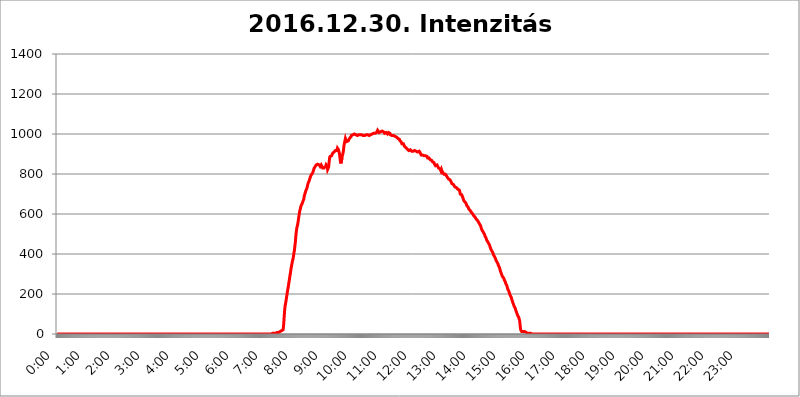
| Category | 2016.12.30. Intenzitás [W/m^2] |
|---|---|
| 0.0 | 0 |
| 0.0006944444444444445 | 0 |
| 0.001388888888888889 | 0 |
| 0.0020833333333333333 | 0 |
| 0.002777777777777778 | 0 |
| 0.003472222222222222 | 0 |
| 0.004166666666666667 | 0 |
| 0.004861111111111111 | 0 |
| 0.005555555555555556 | 0 |
| 0.0062499999999999995 | 0 |
| 0.006944444444444444 | 0 |
| 0.007638888888888889 | 0 |
| 0.008333333333333333 | 0 |
| 0.009027777777777779 | 0 |
| 0.009722222222222222 | 0 |
| 0.010416666666666666 | 0 |
| 0.011111111111111112 | 0 |
| 0.011805555555555555 | 0 |
| 0.012499999999999999 | 0 |
| 0.013194444444444444 | 0 |
| 0.013888888888888888 | 0 |
| 0.014583333333333332 | 0 |
| 0.015277777777777777 | 0 |
| 0.015972222222222224 | 0 |
| 0.016666666666666666 | 0 |
| 0.017361111111111112 | 0 |
| 0.018055555555555557 | 0 |
| 0.01875 | 0 |
| 0.019444444444444445 | 0 |
| 0.02013888888888889 | 0 |
| 0.020833333333333332 | 0 |
| 0.02152777777777778 | 0 |
| 0.022222222222222223 | 0 |
| 0.02291666666666667 | 0 |
| 0.02361111111111111 | 0 |
| 0.024305555555555556 | 0 |
| 0.024999999999999998 | 0 |
| 0.025694444444444447 | 0 |
| 0.02638888888888889 | 0 |
| 0.027083333333333334 | 0 |
| 0.027777777777777776 | 0 |
| 0.02847222222222222 | 0 |
| 0.029166666666666664 | 0 |
| 0.029861111111111113 | 0 |
| 0.030555555555555555 | 0 |
| 0.03125 | 0 |
| 0.03194444444444445 | 0 |
| 0.03263888888888889 | 0 |
| 0.03333333333333333 | 0 |
| 0.034027777777777775 | 0 |
| 0.034722222222222224 | 0 |
| 0.035416666666666666 | 0 |
| 0.036111111111111115 | 0 |
| 0.03680555555555556 | 0 |
| 0.0375 | 0 |
| 0.03819444444444444 | 0 |
| 0.03888888888888889 | 0 |
| 0.03958333333333333 | 0 |
| 0.04027777777777778 | 0 |
| 0.04097222222222222 | 0 |
| 0.041666666666666664 | 0 |
| 0.042361111111111106 | 0 |
| 0.04305555555555556 | 0 |
| 0.043750000000000004 | 0 |
| 0.044444444444444446 | 0 |
| 0.04513888888888889 | 0 |
| 0.04583333333333334 | 0 |
| 0.04652777777777778 | 0 |
| 0.04722222222222222 | 0 |
| 0.04791666666666666 | 0 |
| 0.04861111111111111 | 0 |
| 0.049305555555555554 | 0 |
| 0.049999999999999996 | 0 |
| 0.05069444444444445 | 0 |
| 0.051388888888888894 | 0 |
| 0.052083333333333336 | 0 |
| 0.05277777777777778 | 0 |
| 0.05347222222222222 | 0 |
| 0.05416666666666667 | 0 |
| 0.05486111111111111 | 0 |
| 0.05555555555555555 | 0 |
| 0.05625 | 0 |
| 0.05694444444444444 | 0 |
| 0.057638888888888885 | 0 |
| 0.05833333333333333 | 0 |
| 0.05902777777777778 | 0 |
| 0.059722222222222225 | 0 |
| 0.06041666666666667 | 0 |
| 0.061111111111111116 | 0 |
| 0.06180555555555556 | 0 |
| 0.0625 | 0 |
| 0.06319444444444444 | 0 |
| 0.06388888888888888 | 0 |
| 0.06458333333333334 | 0 |
| 0.06527777777777778 | 0 |
| 0.06597222222222222 | 0 |
| 0.06666666666666667 | 0 |
| 0.06736111111111111 | 0 |
| 0.06805555555555555 | 0 |
| 0.06874999999999999 | 0 |
| 0.06944444444444443 | 0 |
| 0.07013888888888889 | 0 |
| 0.07083333333333333 | 0 |
| 0.07152777777777779 | 0 |
| 0.07222222222222223 | 0 |
| 0.07291666666666667 | 0 |
| 0.07361111111111111 | 0 |
| 0.07430555555555556 | 0 |
| 0.075 | 0 |
| 0.07569444444444444 | 0 |
| 0.0763888888888889 | 0 |
| 0.07708333333333334 | 0 |
| 0.07777777777777778 | 0 |
| 0.07847222222222222 | 0 |
| 0.07916666666666666 | 0 |
| 0.0798611111111111 | 0 |
| 0.08055555555555556 | 0 |
| 0.08125 | 0 |
| 0.08194444444444444 | 0 |
| 0.08263888888888889 | 0 |
| 0.08333333333333333 | 0 |
| 0.08402777777777777 | 0 |
| 0.08472222222222221 | 0 |
| 0.08541666666666665 | 0 |
| 0.08611111111111112 | 0 |
| 0.08680555555555557 | 0 |
| 0.08750000000000001 | 0 |
| 0.08819444444444445 | 0 |
| 0.08888888888888889 | 0 |
| 0.08958333333333333 | 0 |
| 0.09027777777777778 | 0 |
| 0.09097222222222222 | 0 |
| 0.09166666666666667 | 0 |
| 0.09236111111111112 | 0 |
| 0.09305555555555556 | 0 |
| 0.09375 | 0 |
| 0.09444444444444444 | 0 |
| 0.09513888888888888 | 0 |
| 0.09583333333333333 | 0 |
| 0.09652777777777777 | 0 |
| 0.09722222222222222 | 0 |
| 0.09791666666666667 | 0 |
| 0.09861111111111111 | 0 |
| 0.09930555555555555 | 0 |
| 0.09999999999999999 | 0 |
| 0.10069444444444443 | 0 |
| 0.1013888888888889 | 0 |
| 0.10208333333333335 | 0 |
| 0.10277777777777779 | 0 |
| 0.10347222222222223 | 0 |
| 0.10416666666666667 | 0 |
| 0.10486111111111111 | 0 |
| 0.10555555555555556 | 0 |
| 0.10625 | 0 |
| 0.10694444444444444 | 0 |
| 0.1076388888888889 | 0 |
| 0.10833333333333334 | 0 |
| 0.10902777777777778 | 0 |
| 0.10972222222222222 | 0 |
| 0.1111111111111111 | 0 |
| 0.11180555555555556 | 0 |
| 0.11180555555555556 | 0 |
| 0.1125 | 0 |
| 0.11319444444444444 | 0 |
| 0.11388888888888889 | 0 |
| 0.11458333333333333 | 0 |
| 0.11527777777777777 | 0 |
| 0.11597222222222221 | 0 |
| 0.11666666666666665 | 0 |
| 0.1173611111111111 | 0 |
| 0.11805555555555557 | 0 |
| 0.11944444444444445 | 0 |
| 0.12013888888888889 | 0 |
| 0.12083333333333333 | 0 |
| 0.12152777777777778 | 0 |
| 0.12222222222222223 | 0 |
| 0.12291666666666667 | 0 |
| 0.12291666666666667 | 0 |
| 0.12361111111111112 | 0 |
| 0.12430555555555556 | 0 |
| 0.125 | 0 |
| 0.12569444444444444 | 0 |
| 0.12638888888888888 | 0 |
| 0.12708333333333333 | 0 |
| 0.16875 | 0 |
| 0.12847222222222224 | 0 |
| 0.12916666666666668 | 0 |
| 0.12986111111111112 | 0 |
| 0.13055555555555556 | 0 |
| 0.13125 | 0 |
| 0.13194444444444445 | 0 |
| 0.1326388888888889 | 0 |
| 0.13333333333333333 | 0 |
| 0.13402777777777777 | 0 |
| 0.13402777777777777 | 0 |
| 0.13472222222222222 | 0 |
| 0.13541666666666666 | 0 |
| 0.1361111111111111 | 0 |
| 0.13749999999999998 | 0 |
| 0.13819444444444443 | 0 |
| 0.1388888888888889 | 0 |
| 0.13958333333333334 | 0 |
| 0.14027777777777778 | 0 |
| 0.14097222222222222 | 0 |
| 0.14166666666666666 | 0 |
| 0.1423611111111111 | 0 |
| 0.14305555555555557 | 0 |
| 0.14375000000000002 | 0 |
| 0.14444444444444446 | 0 |
| 0.1451388888888889 | 0 |
| 0.1451388888888889 | 0 |
| 0.14652777777777778 | 0 |
| 0.14722222222222223 | 0 |
| 0.14791666666666667 | 0 |
| 0.1486111111111111 | 0 |
| 0.14930555555555555 | 0 |
| 0.15 | 0 |
| 0.15069444444444444 | 0 |
| 0.15138888888888888 | 0 |
| 0.15208333333333332 | 0 |
| 0.15277777777777776 | 0 |
| 0.15347222222222223 | 0 |
| 0.15416666666666667 | 0 |
| 0.15486111111111112 | 0 |
| 0.15555555555555556 | 0 |
| 0.15625 | 0 |
| 0.15694444444444444 | 0 |
| 0.15763888888888888 | 0 |
| 0.15833333333333333 | 0 |
| 0.15902777777777777 | 0 |
| 0.15972222222222224 | 0 |
| 0.16041666666666668 | 0 |
| 0.16111111111111112 | 0 |
| 0.16180555555555556 | 0 |
| 0.1625 | 0 |
| 0.16319444444444445 | 0 |
| 0.1638888888888889 | 0 |
| 0.16458333333333333 | 0 |
| 0.16527777777777777 | 0 |
| 0.16597222222222222 | 0 |
| 0.16666666666666666 | 0 |
| 0.1673611111111111 | 0 |
| 0.16805555555555554 | 0 |
| 0.16874999999999998 | 0 |
| 0.16944444444444443 | 0 |
| 0.17013888888888887 | 0 |
| 0.1708333333333333 | 0 |
| 0.17152777777777775 | 0 |
| 0.17222222222222225 | 0 |
| 0.1729166666666667 | 0 |
| 0.17361111111111113 | 0 |
| 0.17430555555555557 | 0 |
| 0.17500000000000002 | 0 |
| 0.17569444444444446 | 0 |
| 0.1763888888888889 | 0 |
| 0.17708333333333334 | 0 |
| 0.17777777777777778 | 0 |
| 0.17847222222222223 | 0 |
| 0.17916666666666667 | 0 |
| 0.1798611111111111 | 0 |
| 0.18055555555555555 | 0 |
| 0.18125 | 0 |
| 0.18194444444444444 | 0 |
| 0.1826388888888889 | 0 |
| 0.18333333333333335 | 0 |
| 0.1840277777777778 | 0 |
| 0.18472222222222223 | 0 |
| 0.18541666666666667 | 0 |
| 0.18611111111111112 | 0 |
| 0.18680555555555556 | 0 |
| 0.1875 | 0 |
| 0.18819444444444444 | 0 |
| 0.18888888888888888 | 0 |
| 0.18958333333333333 | 0 |
| 0.19027777777777777 | 0 |
| 0.1909722222222222 | 0 |
| 0.19166666666666665 | 0 |
| 0.19236111111111112 | 0 |
| 0.19305555555555554 | 0 |
| 0.19375 | 0 |
| 0.19444444444444445 | 0 |
| 0.1951388888888889 | 0 |
| 0.19583333333333333 | 0 |
| 0.19652777777777777 | 0 |
| 0.19722222222222222 | 0 |
| 0.19791666666666666 | 0 |
| 0.1986111111111111 | 0 |
| 0.19930555555555554 | 0 |
| 0.19999999999999998 | 0 |
| 0.20069444444444443 | 0 |
| 0.20138888888888887 | 0 |
| 0.2020833333333333 | 0 |
| 0.2027777777777778 | 0 |
| 0.2034722222222222 | 0 |
| 0.2041666666666667 | 0 |
| 0.20486111111111113 | 0 |
| 0.20555555555555557 | 0 |
| 0.20625000000000002 | 0 |
| 0.20694444444444446 | 0 |
| 0.2076388888888889 | 0 |
| 0.20833333333333334 | 0 |
| 0.20902777777777778 | 0 |
| 0.20972222222222223 | 0 |
| 0.21041666666666667 | 0 |
| 0.2111111111111111 | 0 |
| 0.21180555555555555 | 0 |
| 0.2125 | 0 |
| 0.21319444444444444 | 0 |
| 0.2138888888888889 | 0 |
| 0.21458333333333335 | 0 |
| 0.2152777777777778 | 0 |
| 0.21597222222222223 | 0 |
| 0.21666666666666667 | 0 |
| 0.21736111111111112 | 0 |
| 0.21805555555555556 | 0 |
| 0.21875 | 0 |
| 0.21944444444444444 | 0 |
| 0.22013888888888888 | 0 |
| 0.22083333333333333 | 0 |
| 0.22152777777777777 | 0 |
| 0.2222222222222222 | 0 |
| 0.22291666666666665 | 0 |
| 0.2236111111111111 | 0 |
| 0.22430555555555556 | 0 |
| 0.225 | 0 |
| 0.22569444444444445 | 0 |
| 0.2263888888888889 | 0 |
| 0.22708333333333333 | 0 |
| 0.22777777777777777 | 0 |
| 0.22847222222222222 | 0 |
| 0.22916666666666666 | 0 |
| 0.2298611111111111 | 0 |
| 0.23055555555555554 | 0 |
| 0.23124999999999998 | 0 |
| 0.23194444444444443 | 0 |
| 0.23263888888888887 | 0 |
| 0.2333333333333333 | 0 |
| 0.2340277777777778 | 0 |
| 0.2347222222222222 | 0 |
| 0.2354166666666667 | 0 |
| 0.23611111111111113 | 0 |
| 0.23680555555555557 | 0 |
| 0.23750000000000002 | 0 |
| 0.23819444444444446 | 0 |
| 0.2388888888888889 | 0 |
| 0.23958333333333334 | 0 |
| 0.24027777777777778 | 0 |
| 0.24097222222222223 | 0 |
| 0.24166666666666667 | 0 |
| 0.2423611111111111 | 0 |
| 0.24305555555555555 | 0 |
| 0.24375 | 0 |
| 0.24444444444444446 | 0 |
| 0.24513888888888888 | 0 |
| 0.24583333333333335 | 0 |
| 0.2465277777777778 | 0 |
| 0.24722222222222223 | 0 |
| 0.24791666666666667 | 0 |
| 0.24861111111111112 | 0 |
| 0.24930555555555556 | 0 |
| 0.25 | 0 |
| 0.25069444444444444 | 0 |
| 0.2513888888888889 | 0 |
| 0.2520833333333333 | 0 |
| 0.25277777777777777 | 0 |
| 0.2534722222222222 | 0 |
| 0.25416666666666665 | 0 |
| 0.2548611111111111 | 0 |
| 0.2555555555555556 | 0 |
| 0.25625000000000003 | 0 |
| 0.2569444444444445 | 0 |
| 0.2576388888888889 | 0 |
| 0.25833333333333336 | 0 |
| 0.2590277777777778 | 0 |
| 0.25972222222222224 | 0 |
| 0.2604166666666667 | 0 |
| 0.2611111111111111 | 0 |
| 0.26180555555555557 | 0 |
| 0.2625 | 0 |
| 0.26319444444444445 | 0 |
| 0.2638888888888889 | 0 |
| 0.26458333333333334 | 0 |
| 0.2652777777777778 | 0 |
| 0.2659722222222222 | 0 |
| 0.26666666666666666 | 0 |
| 0.2673611111111111 | 0 |
| 0.26805555555555555 | 0 |
| 0.26875 | 0 |
| 0.26944444444444443 | 0 |
| 0.2701388888888889 | 0 |
| 0.2708333333333333 | 0 |
| 0.27152777777777776 | 0 |
| 0.2722222222222222 | 0 |
| 0.27291666666666664 | 0 |
| 0.2736111111111111 | 0 |
| 0.2743055555555555 | 0 |
| 0.27499999999999997 | 0 |
| 0.27569444444444446 | 0 |
| 0.27638888888888885 | 0 |
| 0.27708333333333335 | 0 |
| 0.2777777777777778 | 0 |
| 0.27847222222222223 | 0 |
| 0.2791666666666667 | 0 |
| 0.2798611111111111 | 0 |
| 0.28055555555555556 | 0 |
| 0.28125 | 0 |
| 0.28194444444444444 | 0 |
| 0.2826388888888889 | 0 |
| 0.2833333333333333 | 0 |
| 0.28402777777777777 | 0 |
| 0.2847222222222222 | 0 |
| 0.28541666666666665 | 0 |
| 0.28611111111111115 | 0 |
| 0.28680555555555554 | 0 |
| 0.28750000000000003 | 0 |
| 0.2881944444444445 | 0 |
| 0.2888888888888889 | 0 |
| 0.28958333333333336 | 0 |
| 0.2902777777777778 | 0 |
| 0.29097222222222224 | 0 |
| 0.2916666666666667 | 0 |
| 0.2923611111111111 | 0 |
| 0.29305555555555557 | 0 |
| 0.29375 | 0 |
| 0.29444444444444445 | 0 |
| 0.2951388888888889 | 0 |
| 0.29583333333333334 | 0 |
| 0.2965277777777778 | 0 |
| 0.2972222222222222 | 0 |
| 0.29791666666666666 | 0 |
| 0.2986111111111111 | 0 |
| 0.29930555555555555 | 0 |
| 0.3 | 0 |
| 0.30069444444444443 | 0 |
| 0.3013888888888889 | 0 |
| 0.3020833333333333 | 3.525 |
| 0.30277777777777776 | 3.525 |
| 0.3034722222222222 | 3.525 |
| 0.30416666666666664 | 3.525 |
| 0.3048611111111111 | 3.525 |
| 0.3055555555555555 | 3.525 |
| 0.30624999999999997 | 3.525 |
| 0.3069444444444444 | 3.525 |
| 0.3076388888888889 | 3.525 |
| 0.30833333333333335 | 7.887 |
| 0.3090277777777778 | 7.887 |
| 0.30972222222222223 | 7.887 |
| 0.3104166666666667 | 7.887 |
| 0.3111111111111111 | 7.887 |
| 0.31180555555555556 | 12.257 |
| 0.3125 | 12.257 |
| 0.31319444444444444 | 12.257 |
| 0.3138888888888889 | 12.257 |
| 0.3145833333333333 | 16.636 |
| 0.31527777777777777 | 16.636 |
| 0.3159722222222222 | 21.024 |
| 0.31666666666666665 | 21.024 |
| 0.31736111111111115 | 38.653 |
| 0.31805555555555554 | 74.246 |
| 0.31875000000000003 | 110.201 |
| 0.3194444444444445 | 137.347 |
| 0.3201388888888889 | 150.964 |
| 0.32083333333333336 | 164.605 |
| 0.3215277777777778 | 182.82 |
| 0.32222222222222224 | 196.497 |
| 0.3229166666666667 | 214.746 |
| 0.3236111111111111 | 228.436 |
| 0.32430555555555557 | 242.127 |
| 0.325 | 260.373 |
| 0.32569444444444445 | 274.047 |
| 0.3263888888888889 | 292.259 |
| 0.32708333333333334 | 305.898 |
| 0.3277777777777778 | 324.052 |
| 0.3284722222222222 | 337.639 |
| 0.32916666666666666 | 351.198 |
| 0.3298611111111111 | 364.728 |
| 0.33055555555555555 | 373.729 |
| 0.33125 | 387.202 |
| 0.33194444444444443 | 405.108 |
| 0.3326388888888889 | 418.492 |
| 0.3333333333333333 | 440.702 |
| 0.3340277777777778 | 462.786 |
| 0.3347222222222222 | 493.475 |
| 0.3354166666666667 | 515.223 |
| 0.3361111111111111 | 532.513 |
| 0.3368055555555556 | 541.121 |
| 0.33749999999999997 | 553.986 |
| 0.33819444444444446 | 571.049 |
| 0.33888888888888885 | 588.009 |
| 0.33958333333333335 | 604.864 |
| 0.34027777777777773 | 617.436 |
| 0.34097222222222223 | 625.784 |
| 0.3416666666666666 | 638.256 |
| 0.3423611111111111 | 642.4 |
| 0.3430555555555555 | 642.4 |
| 0.34375 | 654.791 |
| 0.3444444444444445 | 658.909 |
| 0.3451388888888889 | 658.909 |
| 0.3458333333333334 | 675.311 |
| 0.34652777777777777 | 691.608 |
| 0.34722222222222227 | 699.717 |
| 0.34791666666666665 | 707.8 |
| 0.34861111111111115 | 715.858 |
| 0.34930555555555554 | 719.877 |
| 0.35000000000000003 | 727.896 |
| 0.3506944444444444 | 735.89 |
| 0.3513888888888889 | 747.834 |
| 0.3520833333333333 | 755.766 |
| 0.3527777777777778 | 759.723 |
| 0.3534722222222222 | 767.62 |
| 0.3541666666666667 | 775.492 |
| 0.3548611111111111 | 783.342 |
| 0.35555555555555557 | 791.169 |
| 0.35625 | 791.169 |
| 0.35694444444444445 | 798.974 |
| 0.3576388888888889 | 802.868 |
| 0.35833333333333334 | 806.757 |
| 0.3590277777777778 | 814.519 |
| 0.3597222222222222 | 822.26 |
| 0.36041666666666666 | 829.981 |
| 0.3611111111111111 | 833.834 |
| 0.36180555555555555 | 837.682 |
| 0.3625 | 841.526 |
| 0.36319444444444443 | 845.365 |
| 0.3638888888888889 | 849.199 |
| 0.3645833333333333 | 849.199 |
| 0.3652777777777778 | 849.199 |
| 0.3659722222222222 | 849.199 |
| 0.3666666666666667 | 849.199 |
| 0.3673611111111111 | 845.365 |
| 0.3680555555555556 | 841.526 |
| 0.36874999999999997 | 837.682 |
| 0.36944444444444446 | 841.526 |
| 0.37013888888888885 | 845.365 |
| 0.37083333333333335 | 849.199 |
| 0.37152777777777773 | 841.526 |
| 0.37222222222222223 | 829.981 |
| 0.3729166666666666 | 826.123 |
| 0.3736111111111111 | 829.981 |
| 0.3743055555555555 | 829.981 |
| 0.375 | 829.981 |
| 0.3756944444444445 | 829.981 |
| 0.3763888888888889 | 837.682 |
| 0.3770833333333334 | 845.365 |
| 0.37777777777777777 | 849.199 |
| 0.37847222222222227 | 837.682 |
| 0.37916666666666665 | 822.26 |
| 0.37986111111111115 | 822.26 |
| 0.38055555555555554 | 833.834 |
| 0.38125000000000003 | 856.855 |
| 0.3819444444444444 | 879.719 |
| 0.3826388888888889 | 887.309 |
| 0.3833333333333333 | 891.099 |
| 0.3840277777777778 | 887.309 |
| 0.3847222222222222 | 891.099 |
| 0.3854166666666667 | 894.885 |
| 0.3861111111111111 | 902.447 |
| 0.38680555555555557 | 906.223 |
| 0.3875 | 906.223 |
| 0.38819444444444445 | 909.996 |
| 0.3888888888888889 | 909.996 |
| 0.38958333333333334 | 913.766 |
| 0.3902777777777778 | 917.534 |
| 0.3909722222222222 | 917.534 |
| 0.39166666666666666 | 917.534 |
| 0.3923611111111111 | 917.534 |
| 0.39305555555555555 | 928.819 |
| 0.39375 | 928.819 |
| 0.39444444444444443 | 921.298 |
| 0.3951388888888889 | 909.996 |
| 0.3958333333333333 | 902.447 |
| 0.3965277777777778 | 879.719 |
| 0.3972222222222222 | 860.676 |
| 0.3979166666666667 | 853.029 |
| 0.3986111111111111 | 856.855 |
| 0.3993055555555556 | 879.719 |
| 0.39999999999999997 | 894.885 |
| 0.40069444444444446 | 902.447 |
| 0.40138888888888885 | 917.534 |
| 0.40208333333333335 | 940.082 |
| 0.40277777777777773 | 955.071 |
| 0.40347222222222223 | 966.295 |
| 0.4041666666666666 | 977.508 |
| 0.4048611111111111 | 970.034 |
| 0.4055555555555555 | 966.295 |
| 0.40625 | 962.555 |
| 0.4069444444444445 | 962.555 |
| 0.4076388888888889 | 966.295 |
| 0.4083333333333334 | 966.295 |
| 0.40902777777777777 | 970.034 |
| 0.40972222222222227 | 977.508 |
| 0.41041666666666665 | 981.244 |
| 0.41111111111111115 | 981.244 |
| 0.41180555555555554 | 984.98 |
| 0.41250000000000003 | 992.448 |
| 0.4131944444444444 | 996.182 |
| 0.4138888888888889 | 996.182 |
| 0.4145833333333333 | 996.182 |
| 0.4152777777777778 | 999.916 |
| 0.4159722222222222 | 999.916 |
| 0.4166666666666667 | 999.916 |
| 0.4173611111111111 | 996.182 |
| 0.41805555555555557 | 999.916 |
| 0.41875 | 996.182 |
| 0.41944444444444445 | 999.916 |
| 0.4201388888888889 | 996.182 |
| 0.42083333333333334 | 992.448 |
| 0.4215277777777778 | 996.182 |
| 0.4222222222222222 | 996.182 |
| 0.42291666666666666 | 996.182 |
| 0.4236111111111111 | 992.448 |
| 0.42430555555555555 | 996.182 |
| 0.425 | 996.182 |
| 0.42569444444444443 | 999.916 |
| 0.4263888888888889 | 999.916 |
| 0.4270833333333333 | 996.182 |
| 0.4277777777777778 | 996.182 |
| 0.4284722222222222 | 992.448 |
| 0.4291666666666667 | 992.448 |
| 0.4298611111111111 | 992.448 |
| 0.4305555555555556 | 992.448 |
| 0.43124999999999997 | 992.448 |
| 0.43194444444444446 | 992.448 |
| 0.43263888888888885 | 992.448 |
| 0.43333333333333335 | 996.182 |
| 0.43402777777777773 | 996.182 |
| 0.43472222222222223 | 996.182 |
| 0.4354166666666666 | 996.182 |
| 0.4361111111111111 | 996.182 |
| 0.4368055555555555 | 996.182 |
| 0.4375 | 992.448 |
| 0.4381944444444445 | 996.182 |
| 0.4388888888888889 | 996.182 |
| 0.4395833333333334 | 996.182 |
| 0.44027777777777777 | 992.448 |
| 0.44097222222222227 | 996.182 |
| 0.44166666666666665 | 999.916 |
| 0.44236111111111115 | 1003.65 |
| 0.44305555555555554 | 999.916 |
| 0.44375000000000003 | 1003.65 |
| 0.4444444444444444 | 1003.65 |
| 0.4451388888888889 | 1007.383 |
| 0.4458333333333333 | 1003.65 |
| 0.4465277777777778 | 1003.65 |
| 0.4472222222222222 | 1007.383 |
| 0.4479166666666667 | 1007.383 |
| 0.4486111111111111 | 1011.118 |
| 0.44930555555555557 | 1018.587 |
| 0.45 | 1022.323 |
| 0.45069444444444445 | 1014.852 |
| 0.4513888888888889 | 1007.383 |
| 0.45208333333333334 | 1007.383 |
| 0.4527777777777778 | 1011.118 |
| 0.4534722222222222 | 1011.118 |
| 0.45416666666666666 | 1014.852 |
| 0.4548611111111111 | 1014.852 |
| 0.45555555555555555 | 1014.852 |
| 0.45625 | 1014.852 |
| 0.45694444444444443 | 1011.118 |
| 0.4576388888888889 | 1011.118 |
| 0.4583333333333333 | 1007.383 |
| 0.4590277777777778 | 1003.65 |
| 0.4597222222222222 | 1007.383 |
| 0.4604166666666667 | 1007.383 |
| 0.4611111111111111 | 1007.383 |
| 0.4618055555555556 | 1007.383 |
| 0.46249999999999997 | 1003.65 |
| 0.46319444444444446 | 999.916 |
| 0.46388888888888885 | 999.916 |
| 0.46458333333333335 | 1007.383 |
| 0.46527777777777773 | 1007.383 |
| 0.46597222222222223 | 1007.383 |
| 0.4666666666666666 | 1003.65 |
| 0.4673611111111111 | 996.182 |
| 0.4680555555555555 | 996.182 |
| 0.46875 | 996.182 |
| 0.4694444444444445 | 992.448 |
| 0.4701388888888889 | 992.448 |
| 0.4708333333333334 | 992.448 |
| 0.47152777777777777 | 992.448 |
| 0.47222222222222227 | 988.714 |
| 0.47291666666666665 | 988.714 |
| 0.47361111111111115 | 988.714 |
| 0.47430555555555554 | 988.714 |
| 0.47500000000000003 | 988.714 |
| 0.4756944444444444 | 984.98 |
| 0.4763888888888889 | 984.98 |
| 0.4770833333333333 | 981.244 |
| 0.4777777777777778 | 977.508 |
| 0.4784722222222222 | 973.772 |
| 0.4791666666666667 | 973.772 |
| 0.4798611111111111 | 973.772 |
| 0.48055555555555557 | 966.295 |
| 0.48125 | 962.555 |
| 0.48194444444444445 | 962.555 |
| 0.4826388888888889 | 958.814 |
| 0.48333333333333334 | 951.327 |
| 0.4840277777777778 | 947.58 |
| 0.4847222222222222 | 947.58 |
| 0.48541666666666666 | 951.327 |
| 0.4861111111111111 | 947.58 |
| 0.48680555555555555 | 940.082 |
| 0.4875 | 940.082 |
| 0.48819444444444443 | 940.082 |
| 0.4888888888888889 | 932.576 |
| 0.4895833333333333 | 936.33 |
| 0.4902777777777778 | 928.819 |
| 0.4909722222222222 | 925.06 |
| 0.4916666666666667 | 928.819 |
| 0.4923611111111111 | 921.298 |
| 0.4930555555555556 | 917.534 |
| 0.49374999999999997 | 913.766 |
| 0.49444444444444446 | 917.534 |
| 0.49513888888888885 | 921.298 |
| 0.49583333333333335 | 917.534 |
| 0.49652777777777773 | 917.534 |
| 0.49722222222222223 | 913.766 |
| 0.4979166666666666 | 913.766 |
| 0.4986111111111111 | 913.766 |
| 0.4993055555555555 | 913.766 |
| 0.5 | 917.534 |
| 0.5006944444444444 | 917.534 |
| 0.5013888888888889 | 917.534 |
| 0.5020833333333333 | 921.298 |
| 0.5027777777777778 | 917.534 |
| 0.5034722222222222 | 913.766 |
| 0.5041666666666667 | 909.996 |
| 0.5048611111111111 | 913.766 |
| 0.5055555555555555 | 909.996 |
| 0.50625 | 913.766 |
| 0.5069444444444444 | 913.766 |
| 0.5076388888888889 | 913.766 |
| 0.5083333333333333 | 909.996 |
| 0.5090277777777777 | 906.223 |
| 0.5097222222222222 | 902.447 |
| 0.5104166666666666 | 894.885 |
| 0.5111111111111112 | 894.885 |
| 0.5118055555555555 | 894.885 |
| 0.5125000000000001 | 894.885 |
| 0.5131944444444444 | 894.885 |
| 0.513888888888889 | 891.099 |
| 0.5145833333333333 | 891.099 |
| 0.5152777777777778 | 894.885 |
| 0.5159722222222222 | 894.885 |
| 0.5166666666666667 | 891.099 |
| 0.517361111111111 | 891.099 |
| 0.5180555555555556 | 887.309 |
| 0.5187499999999999 | 887.309 |
| 0.5194444444444445 | 879.719 |
| 0.5201388888888888 | 879.719 |
| 0.5208333333333334 | 879.719 |
| 0.5215277777777778 | 879.719 |
| 0.5222222222222223 | 875.918 |
| 0.5229166666666667 | 872.114 |
| 0.5236111111111111 | 868.305 |
| 0.5243055555555556 | 868.305 |
| 0.525 | 868.305 |
| 0.5256944444444445 | 868.305 |
| 0.5263888888888889 | 860.676 |
| 0.5270833333333333 | 860.676 |
| 0.5277777777777778 | 860.676 |
| 0.5284722222222222 | 856.855 |
| 0.5291666666666667 | 849.199 |
| 0.5298611111111111 | 845.365 |
| 0.5305555555555556 | 841.526 |
| 0.53125 | 845.365 |
| 0.5319444444444444 | 845.365 |
| 0.5326388888888889 | 845.365 |
| 0.5333333333333333 | 841.526 |
| 0.5340277777777778 | 841.526 |
| 0.5347222222222222 | 829.981 |
| 0.5354166666666667 | 826.123 |
| 0.5361111111111111 | 826.123 |
| 0.5368055555555555 | 826.123 |
| 0.5375 | 822.26 |
| 0.5381944444444444 | 814.519 |
| 0.5388888888888889 | 822.26 |
| 0.5395833333333333 | 814.519 |
| 0.5402777777777777 | 810.641 |
| 0.5409722222222222 | 806.757 |
| 0.5416666666666666 | 806.757 |
| 0.5423611111111112 | 798.974 |
| 0.5430555555555555 | 802.868 |
| 0.5437500000000001 | 802.868 |
| 0.5444444444444444 | 798.974 |
| 0.545138888888889 | 795.074 |
| 0.5458333333333333 | 791.169 |
| 0.5465277777777778 | 791.169 |
| 0.5472222222222222 | 783.342 |
| 0.5479166666666667 | 787.258 |
| 0.548611111111111 | 775.492 |
| 0.5493055555555556 | 771.559 |
| 0.5499999999999999 | 771.559 |
| 0.5506944444444445 | 771.559 |
| 0.5513888888888888 | 767.62 |
| 0.5520833333333334 | 763.674 |
| 0.5527777777777778 | 759.723 |
| 0.5534722222222223 | 751.803 |
| 0.5541666666666667 | 755.766 |
| 0.5548611111111111 | 751.803 |
| 0.5555555555555556 | 747.834 |
| 0.55625 | 747.834 |
| 0.5569444444444445 | 743.859 |
| 0.5576388888888889 | 735.89 |
| 0.5583333333333333 | 735.89 |
| 0.5590277777777778 | 731.896 |
| 0.5597222222222222 | 731.896 |
| 0.5604166666666667 | 727.896 |
| 0.5611111111111111 | 727.896 |
| 0.5618055555555556 | 723.889 |
| 0.5625 | 723.889 |
| 0.5631944444444444 | 719.877 |
| 0.5638888888888889 | 719.877 |
| 0.5645833333333333 | 711.832 |
| 0.5652777777777778 | 699.717 |
| 0.5659722222222222 | 699.717 |
| 0.5666666666666667 | 699.717 |
| 0.5673611111111111 | 695.666 |
| 0.5680555555555555 | 691.608 |
| 0.56875 | 683.473 |
| 0.5694444444444444 | 675.311 |
| 0.5701388888888889 | 667.123 |
| 0.5708333333333333 | 667.123 |
| 0.5715277777777777 | 663.019 |
| 0.5722222222222222 | 658.909 |
| 0.5729166666666666 | 654.791 |
| 0.5736111111111112 | 650.667 |
| 0.5743055555555555 | 642.4 |
| 0.5750000000000001 | 638.256 |
| 0.5756944444444444 | 638.256 |
| 0.576388888888889 | 634.105 |
| 0.5770833333333333 | 625.784 |
| 0.5777777777777778 | 625.784 |
| 0.5784722222222222 | 621.613 |
| 0.5791666666666667 | 617.436 |
| 0.579861111111111 | 613.252 |
| 0.5805555555555556 | 609.062 |
| 0.5812499999999999 | 609.062 |
| 0.5819444444444445 | 604.864 |
| 0.5826388888888888 | 600.661 |
| 0.5833333333333334 | 600.661 |
| 0.5840277777777778 | 592.233 |
| 0.5847222222222223 | 592.233 |
| 0.5854166666666667 | 588.009 |
| 0.5861111111111111 | 583.779 |
| 0.5868055555555556 | 579.542 |
| 0.5875 | 575.299 |
| 0.5881944444444445 | 571.049 |
| 0.5888888888888889 | 571.049 |
| 0.5895833333333333 | 566.793 |
| 0.5902777777777778 | 562.53 |
| 0.5909722222222222 | 558.261 |
| 0.5916666666666667 | 553.986 |
| 0.5923611111111111 | 549.704 |
| 0.5930555555555556 | 545.416 |
| 0.59375 | 541.121 |
| 0.5944444444444444 | 532.513 |
| 0.5951388888888889 | 523.88 |
| 0.5958333333333333 | 519.555 |
| 0.5965277777777778 | 515.223 |
| 0.5972222222222222 | 510.885 |
| 0.5979166666666667 | 506.542 |
| 0.5986111111111111 | 502.192 |
| 0.5993055555555555 | 497.836 |
| 0.6 | 489.108 |
| 0.6006944444444444 | 484.735 |
| 0.6013888888888889 | 480.356 |
| 0.6020833333333333 | 471.582 |
| 0.6027777777777777 | 467.187 |
| 0.6034722222222222 | 462.786 |
| 0.6041666666666666 | 458.38 |
| 0.6048611111111112 | 453.968 |
| 0.6055555555555555 | 449.551 |
| 0.6062500000000001 | 445.129 |
| 0.6069444444444444 | 436.27 |
| 0.607638888888889 | 431.833 |
| 0.6083333333333333 | 422.943 |
| 0.6090277777777778 | 418.492 |
| 0.6097222222222222 | 414.035 |
| 0.6104166666666667 | 409.574 |
| 0.611111111111111 | 405.108 |
| 0.6118055555555556 | 396.164 |
| 0.6124999999999999 | 391.685 |
| 0.6131944444444445 | 387.202 |
| 0.6138888888888888 | 382.715 |
| 0.6145833333333334 | 378.224 |
| 0.6152777777777778 | 369.23 |
| 0.6159722222222223 | 364.728 |
| 0.6166666666666667 | 360.221 |
| 0.6173611111111111 | 355.712 |
| 0.6180555555555556 | 351.198 |
| 0.61875 | 342.162 |
| 0.6194444444444445 | 337.639 |
| 0.6201388888888889 | 333.113 |
| 0.6208333333333333 | 324.052 |
| 0.6215277777777778 | 314.98 |
| 0.6222222222222222 | 310.44 |
| 0.6229166666666667 | 301.354 |
| 0.6236111111111111 | 296.808 |
| 0.6243055555555556 | 287.709 |
| 0.625 | 287.709 |
| 0.6256944444444444 | 283.156 |
| 0.6263888888888889 | 278.603 |
| 0.6270833333333333 | 269.49 |
| 0.6277777777777778 | 264.932 |
| 0.6284722222222222 | 260.373 |
| 0.6291666666666667 | 251.251 |
| 0.6298611111111111 | 246.689 |
| 0.6305555555555555 | 242.127 |
| 0.63125 | 233 |
| 0.6319444444444444 | 223.873 |
| 0.6326388888888889 | 219.309 |
| 0.6333333333333333 | 214.746 |
| 0.6340277777777777 | 205.62 |
| 0.6347222222222222 | 201.058 |
| 0.6354166666666666 | 191.937 |
| 0.6361111111111112 | 187.378 |
| 0.6368055555555555 | 182.82 |
| 0.6375000000000001 | 173.709 |
| 0.6381944444444444 | 164.605 |
| 0.638888888888889 | 160.056 |
| 0.6395833333333333 | 150.964 |
| 0.6402777777777778 | 146.423 |
| 0.6409722222222222 | 137.347 |
| 0.6416666666666667 | 132.814 |
| 0.642361111111111 | 128.284 |
| 0.6430555555555556 | 119.235 |
| 0.6437499999999999 | 114.716 |
| 0.6444444444444445 | 105.69 |
| 0.6451388888888888 | 101.184 |
| 0.6458333333333334 | 92.184 |
| 0.6465277777777778 | 87.692 |
| 0.6472222222222223 | 83.205 |
| 0.6479166666666667 | 78.722 |
| 0.6486111111111111 | 65.31 |
| 0.6493055555555556 | 38.653 |
| 0.65 | 21.024 |
| 0.6506944444444445 | 16.636 |
| 0.6513888888888889 | 12.257 |
| 0.6520833333333333 | 12.257 |
| 0.6527777777777778 | 12.257 |
| 0.6534722222222222 | 12.257 |
| 0.6541666666666667 | 12.257 |
| 0.6548611111111111 | 7.887 |
| 0.6555555555555556 | 12.257 |
| 0.65625 | 7.887 |
| 0.6569444444444444 | 7.887 |
| 0.6576388888888889 | 7.887 |
| 0.6583333333333333 | 3.525 |
| 0.6590277777777778 | 3.525 |
| 0.6597222222222222 | 3.525 |
| 0.6604166666666667 | 3.525 |
| 0.6611111111111111 | 3.525 |
| 0.6618055555555555 | 3.525 |
| 0.6625 | 3.525 |
| 0.6631944444444444 | 3.525 |
| 0.6638888888888889 | 3.525 |
| 0.6645833333333333 | 0 |
| 0.6652777777777777 | 3.525 |
| 0.6659722222222222 | 0 |
| 0.6666666666666666 | 0 |
| 0.6673611111111111 | 0 |
| 0.6680555555555556 | 0 |
| 0.6687500000000001 | 0 |
| 0.6694444444444444 | 0 |
| 0.6701388888888888 | 0 |
| 0.6708333333333334 | 0 |
| 0.6715277777777778 | 0 |
| 0.6722222222222222 | 0 |
| 0.6729166666666666 | 0 |
| 0.6736111111111112 | 0 |
| 0.6743055555555556 | 0 |
| 0.6749999999999999 | 0 |
| 0.6756944444444444 | 0 |
| 0.6763888888888889 | 0 |
| 0.6770833333333334 | 0 |
| 0.6777777777777777 | 0 |
| 0.6784722222222223 | 0 |
| 0.6791666666666667 | 0 |
| 0.6798611111111111 | 0 |
| 0.6805555555555555 | 0 |
| 0.68125 | 0 |
| 0.6819444444444445 | 0 |
| 0.6826388888888889 | 0 |
| 0.6833333333333332 | 0 |
| 0.6840277777777778 | 0 |
| 0.6847222222222222 | 0 |
| 0.6854166666666667 | 0 |
| 0.686111111111111 | 0 |
| 0.6868055555555556 | 0 |
| 0.6875 | 0 |
| 0.6881944444444444 | 0 |
| 0.688888888888889 | 0 |
| 0.6895833333333333 | 0 |
| 0.6902777777777778 | 0 |
| 0.6909722222222222 | 0 |
| 0.6916666666666668 | 0 |
| 0.6923611111111111 | 0 |
| 0.6930555555555555 | 0 |
| 0.69375 | 0 |
| 0.6944444444444445 | 0 |
| 0.6951388888888889 | 0 |
| 0.6958333333333333 | 0 |
| 0.6965277777777777 | 0 |
| 0.6972222222222223 | 0 |
| 0.6979166666666666 | 0 |
| 0.6986111111111111 | 0 |
| 0.6993055555555556 | 0 |
| 0.7000000000000001 | 0 |
| 0.7006944444444444 | 0 |
| 0.7013888888888888 | 0 |
| 0.7020833333333334 | 0 |
| 0.7027777777777778 | 0 |
| 0.7034722222222222 | 0 |
| 0.7041666666666666 | 0 |
| 0.7048611111111112 | 0 |
| 0.7055555555555556 | 0 |
| 0.7062499999999999 | 0 |
| 0.7069444444444444 | 0 |
| 0.7076388888888889 | 0 |
| 0.7083333333333334 | 0 |
| 0.7090277777777777 | 0 |
| 0.7097222222222223 | 0 |
| 0.7104166666666667 | 0 |
| 0.7111111111111111 | 0 |
| 0.7118055555555555 | 0 |
| 0.7125 | 0 |
| 0.7131944444444445 | 0 |
| 0.7138888888888889 | 0 |
| 0.7145833333333332 | 0 |
| 0.7152777777777778 | 0 |
| 0.7159722222222222 | 0 |
| 0.7166666666666667 | 0 |
| 0.717361111111111 | 0 |
| 0.7180555555555556 | 0 |
| 0.71875 | 0 |
| 0.7194444444444444 | 0 |
| 0.720138888888889 | 0 |
| 0.7208333333333333 | 0 |
| 0.7215277777777778 | 0 |
| 0.7222222222222222 | 0 |
| 0.7229166666666668 | 0 |
| 0.7236111111111111 | 0 |
| 0.7243055555555555 | 0 |
| 0.725 | 0 |
| 0.7256944444444445 | 0 |
| 0.7263888888888889 | 0 |
| 0.7270833333333333 | 0 |
| 0.7277777777777777 | 0 |
| 0.7284722222222223 | 0 |
| 0.7291666666666666 | 0 |
| 0.7298611111111111 | 0 |
| 0.7305555555555556 | 0 |
| 0.7312500000000001 | 0 |
| 0.7319444444444444 | 0 |
| 0.7326388888888888 | 0 |
| 0.7333333333333334 | 0 |
| 0.7340277777777778 | 0 |
| 0.7347222222222222 | 0 |
| 0.7354166666666666 | 0 |
| 0.7361111111111112 | 0 |
| 0.7368055555555556 | 0 |
| 0.7374999999999999 | 0 |
| 0.7381944444444444 | 0 |
| 0.7388888888888889 | 0 |
| 0.7395833333333334 | 0 |
| 0.7402777777777777 | 0 |
| 0.7409722222222223 | 0 |
| 0.7416666666666667 | 0 |
| 0.7423611111111111 | 0 |
| 0.7430555555555555 | 0 |
| 0.74375 | 0 |
| 0.7444444444444445 | 0 |
| 0.7451388888888889 | 0 |
| 0.7458333333333332 | 0 |
| 0.7465277777777778 | 0 |
| 0.7472222222222222 | 0 |
| 0.7479166666666667 | 0 |
| 0.748611111111111 | 0 |
| 0.7493055555555556 | 0 |
| 0.75 | 0 |
| 0.7506944444444444 | 0 |
| 0.751388888888889 | 0 |
| 0.7520833333333333 | 0 |
| 0.7527777777777778 | 0 |
| 0.7534722222222222 | 0 |
| 0.7541666666666668 | 0 |
| 0.7548611111111111 | 0 |
| 0.7555555555555555 | 0 |
| 0.75625 | 0 |
| 0.7569444444444445 | 0 |
| 0.7576388888888889 | 0 |
| 0.7583333333333333 | 0 |
| 0.7590277777777777 | 0 |
| 0.7597222222222223 | 0 |
| 0.7604166666666666 | 0 |
| 0.7611111111111111 | 0 |
| 0.7618055555555556 | 0 |
| 0.7625000000000001 | 0 |
| 0.7631944444444444 | 0 |
| 0.7638888888888888 | 0 |
| 0.7645833333333334 | 0 |
| 0.7652777777777778 | 0 |
| 0.7659722222222222 | 0 |
| 0.7666666666666666 | 0 |
| 0.7673611111111112 | 0 |
| 0.7680555555555556 | 0 |
| 0.7687499999999999 | 0 |
| 0.7694444444444444 | 0 |
| 0.7701388888888889 | 0 |
| 0.7708333333333334 | 0 |
| 0.7715277777777777 | 0 |
| 0.7722222222222223 | 0 |
| 0.7729166666666667 | 0 |
| 0.7736111111111111 | 0 |
| 0.7743055555555555 | 0 |
| 0.775 | 0 |
| 0.7756944444444445 | 0 |
| 0.7763888888888889 | 0 |
| 0.7770833333333332 | 0 |
| 0.7777777777777778 | 0 |
| 0.7784722222222222 | 0 |
| 0.7791666666666667 | 0 |
| 0.779861111111111 | 0 |
| 0.7805555555555556 | 0 |
| 0.78125 | 0 |
| 0.7819444444444444 | 0 |
| 0.782638888888889 | 0 |
| 0.7833333333333333 | 0 |
| 0.7840277777777778 | 0 |
| 0.7847222222222222 | 0 |
| 0.7854166666666668 | 0 |
| 0.7861111111111111 | 0 |
| 0.7868055555555555 | 0 |
| 0.7875 | 0 |
| 0.7881944444444445 | 0 |
| 0.7888888888888889 | 0 |
| 0.7895833333333333 | 0 |
| 0.7902777777777777 | 0 |
| 0.7909722222222223 | 0 |
| 0.7916666666666666 | 0 |
| 0.7923611111111111 | 0 |
| 0.7930555555555556 | 0 |
| 0.7937500000000001 | 0 |
| 0.7944444444444444 | 0 |
| 0.7951388888888888 | 0 |
| 0.7958333333333334 | 0 |
| 0.7965277777777778 | 0 |
| 0.7972222222222222 | 0 |
| 0.7979166666666666 | 0 |
| 0.7986111111111112 | 0 |
| 0.7993055555555556 | 0 |
| 0.7999999999999999 | 0 |
| 0.8006944444444444 | 0 |
| 0.8013888888888889 | 0 |
| 0.8020833333333334 | 0 |
| 0.8027777777777777 | 0 |
| 0.8034722222222223 | 0 |
| 0.8041666666666667 | 0 |
| 0.8048611111111111 | 0 |
| 0.8055555555555555 | 0 |
| 0.80625 | 0 |
| 0.8069444444444445 | 0 |
| 0.8076388888888889 | 0 |
| 0.8083333333333332 | 0 |
| 0.8090277777777778 | 0 |
| 0.8097222222222222 | 0 |
| 0.8104166666666667 | 0 |
| 0.811111111111111 | 0 |
| 0.8118055555555556 | 0 |
| 0.8125 | 0 |
| 0.8131944444444444 | 0 |
| 0.813888888888889 | 0 |
| 0.8145833333333333 | 0 |
| 0.8152777777777778 | 0 |
| 0.8159722222222222 | 0 |
| 0.8166666666666668 | 0 |
| 0.8173611111111111 | 0 |
| 0.8180555555555555 | 0 |
| 0.81875 | 0 |
| 0.8194444444444445 | 0 |
| 0.8201388888888889 | 0 |
| 0.8208333333333333 | 0 |
| 0.8215277777777777 | 0 |
| 0.8222222222222223 | 0 |
| 0.8229166666666666 | 0 |
| 0.8236111111111111 | 0 |
| 0.8243055555555556 | 0 |
| 0.8250000000000001 | 0 |
| 0.8256944444444444 | 0 |
| 0.8263888888888888 | 0 |
| 0.8270833333333334 | 0 |
| 0.8277777777777778 | 0 |
| 0.8284722222222222 | 0 |
| 0.8291666666666666 | 0 |
| 0.8298611111111112 | 0 |
| 0.8305555555555556 | 0 |
| 0.8312499999999999 | 0 |
| 0.8319444444444444 | 0 |
| 0.8326388888888889 | 0 |
| 0.8333333333333334 | 0 |
| 0.8340277777777777 | 0 |
| 0.8347222222222223 | 0 |
| 0.8354166666666667 | 0 |
| 0.8361111111111111 | 0 |
| 0.8368055555555555 | 0 |
| 0.8375 | 0 |
| 0.8381944444444445 | 0 |
| 0.8388888888888889 | 0 |
| 0.8395833333333332 | 0 |
| 0.8402777777777778 | 0 |
| 0.8409722222222222 | 0 |
| 0.8416666666666667 | 0 |
| 0.842361111111111 | 0 |
| 0.8430555555555556 | 0 |
| 0.84375 | 0 |
| 0.8444444444444444 | 0 |
| 0.845138888888889 | 0 |
| 0.8458333333333333 | 0 |
| 0.8465277777777778 | 0 |
| 0.8472222222222222 | 0 |
| 0.8479166666666668 | 0 |
| 0.8486111111111111 | 0 |
| 0.8493055555555555 | 0 |
| 0.85 | 0 |
| 0.8506944444444445 | 0 |
| 0.8513888888888889 | 0 |
| 0.8520833333333333 | 0 |
| 0.8527777777777777 | 0 |
| 0.8534722222222223 | 0 |
| 0.8541666666666666 | 0 |
| 0.8548611111111111 | 0 |
| 0.8555555555555556 | 0 |
| 0.8562500000000001 | 0 |
| 0.8569444444444444 | 0 |
| 0.8576388888888888 | 0 |
| 0.8583333333333334 | 0 |
| 0.8590277777777778 | 0 |
| 0.8597222222222222 | 0 |
| 0.8604166666666666 | 0 |
| 0.8611111111111112 | 0 |
| 0.8618055555555556 | 0 |
| 0.8624999999999999 | 0 |
| 0.8631944444444444 | 0 |
| 0.8638888888888889 | 0 |
| 0.8645833333333334 | 0 |
| 0.8652777777777777 | 0 |
| 0.8659722222222223 | 0 |
| 0.8666666666666667 | 0 |
| 0.8673611111111111 | 0 |
| 0.8680555555555555 | 0 |
| 0.86875 | 0 |
| 0.8694444444444445 | 0 |
| 0.8701388888888889 | 0 |
| 0.8708333333333332 | 0 |
| 0.8715277777777778 | 0 |
| 0.8722222222222222 | 0 |
| 0.8729166666666667 | 0 |
| 0.873611111111111 | 0 |
| 0.8743055555555556 | 0 |
| 0.875 | 0 |
| 0.8756944444444444 | 0 |
| 0.876388888888889 | 0 |
| 0.8770833333333333 | 0 |
| 0.8777777777777778 | 0 |
| 0.8784722222222222 | 0 |
| 0.8791666666666668 | 0 |
| 0.8798611111111111 | 0 |
| 0.8805555555555555 | 0 |
| 0.88125 | 0 |
| 0.8819444444444445 | 0 |
| 0.8826388888888889 | 0 |
| 0.8833333333333333 | 0 |
| 0.8840277777777777 | 0 |
| 0.8847222222222223 | 0 |
| 0.8854166666666666 | 0 |
| 0.8861111111111111 | 0 |
| 0.8868055555555556 | 0 |
| 0.8875000000000001 | 0 |
| 0.8881944444444444 | 0 |
| 0.8888888888888888 | 0 |
| 0.8895833333333334 | 0 |
| 0.8902777777777778 | 0 |
| 0.8909722222222222 | 0 |
| 0.8916666666666666 | 0 |
| 0.8923611111111112 | 0 |
| 0.8930555555555556 | 0 |
| 0.8937499999999999 | 0 |
| 0.8944444444444444 | 0 |
| 0.8951388888888889 | 0 |
| 0.8958333333333334 | 0 |
| 0.8965277777777777 | 0 |
| 0.8972222222222223 | 0 |
| 0.8979166666666667 | 0 |
| 0.8986111111111111 | 0 |
| 0.8993055555555555 | 0 |
| 0.9 | 0 |
| 0.9006944444444445 | 0 |
| 0.9013888888888889 | 0 |
| 0.9020833333333332 | 0 |
| 0.9027777777777778 | 0 |
| 0.9034722222222222 | 0 |
| 0.9041666666666667 | 0 |
| 0.904861111111111 | 0 |
| 0.9055555555555556 | 0 |
| 0.90625 | 0 |
| 0.9069444444444444 | 0 |
| 0.907638888888889 | 0 |
| 0.9083333333333333 | 0 |
| 0.9090277777777778 | 0 |
| 0.9097222222222222 | 0 |
| 0.9104166666666668 | 0 |
| 0.9111111111111111 | 0 |
| 0.9118055555555555 | 0 |
| 0.9125 | 0 |
| 0.9131944444444445 | 0 |
| 0.9138888888888889 | 0 |
| 0.9145833333333333 | 0 |
| 0.9152777777777777 | 0 |
| 0.9159722222222223 | 0 |
| 0.9166666666666666 | 0 |
| 0.9173611111111111 | 0 |
| 0.9180555555555556 | 0 |
| 0.9187500000000001 | 0 |
| 0.9194444444444444 | 0 |
| 0.9201388888888888 | 0 |
| 0.9208333333333334 | 0 |
| 0.9215277777777778 | 0 |
| 0.9222222222222222 | 0 |
| 0.9229166666666666 | 0 |
| 0.9236111111111112 | 0 |
| 0.9243055555555556 | 0 |
| 0.9249999999999999 | 0 |
| 0.9256944444444444 | 0 |
| 0.9263888888888889 | 0 |
| 0.9270833333333334 | 0 |
| 0.9277777777777777 | 0 |
| 0.9284722222222223 | 0 |
| 0.9291666666666667 | 0 |
| 0.9298611111111111 | 0 |
| 0.9305555555555555 | 0 |
| 0.93125 | 0 |
| 0.9319444444444445 | 0 |
| 0.9326388888888889 | 0 |
| 0.9333333333333332 | 0 |
| 0.9340277777777778 | 0 |
| 0.9347222222222222 | 0 |
| 0.9354166666666667 | 0 |
| 0.936111111111111 | 0 |
| 0.9368055555555556 | 0 |
| 0.9375 | 0 |
| 0.9381944444444444 | 0 |
| 0.938888888888889 | 0 |
| 0.9395833333333333 | 0 |
| 0.9402777777777778 | 0 |
| 0.9409722222222222 | 0 |
| 0.9416666666666668 | 0 |
| 0.9423611111111111 | 0 |
| 0.9430555555555555 | 0 |
| 0.94375 | 0 |
| 0.9444444444444445 | 0 |
| 0.9451388888888889 | 0 |
| 0.9458333333333333 | 0 |
| 0.9465277777777777 | 0 |
| 0.9472222222222223 | 0 |
| 0.9479166666666666 | 0 |
| 0.9486111111111111 | 0 |
| 0.9493055555555556 | 0 |
| 0.9500000000000001 | 0 |
| 0.9506944444444444 | 0 |
| 0.9513888888888888 | 0 |
| 0.9520833333333334 | 0 |
| 0.9527777777777778 | 0 |
| 0.9534722222222222 | 0 |
| 0.9541666666666666 | 0 |
| 0.9548611111111112 | 0 |
| 0.9555555555555556 | 0 |
| 0.9562499999999999 | 0 |
| 0.9569444444444444 | 0 |
| 0.9576388888888889 | 0 |
| 0.9583333333333334 | 0 |
| 0.9590277777777777 | 0 |
| 0.9597222222222223 | 0 |
| 0.9604166666666667 | 0 |
| 0.9611111111111111 | 0 |
| 0.9618055555555555 | 0 |
| 0.9625 | 0 |
| 0.9631944444444445 | 0 |
| 0.9638888888888889 | 0 |
| 0.9645833333333332 | 0 |
| 0.9652777777777778 | 0 |
| 0.9659722222222222 | 0 |
| 0.9666666666666667 | 0 |
| 0.967361111111111 | 0 |
| 0.9680555555555556 | 0 |
| 0.96875 | 0 |
| 0.9694444444444444 | 0 |
| 0.970138888888889 | 0 |
| 0.9708333333333333 | 0 |
| 0.9715277777777778 | 0 |
| 0.9722222222222222 | 0 |
| 0.9729166666666668 | 0 |
| 0.9736111111111111 | 0 |
| 0.9743055555555555 | 0 |
| 0.975 | 0 |
| 0.9756944444444445 | 0 |
| 0.9763888888888889 | 0 |
| 0.9770833333333333 | 0 |
| 0.9777777777777777 | 0 |
| 0.9784722222222223 | 0 |
| 0.9791666666666666 | 0 |
| 0.9798611111111111 | 0 |
| 0.9805555555555556 | 0 |
| 0.9812500000000001 | 0 |
| 0.9819444444444444 | 0 |
| 0.9826388888888888 | 0 |
| 0.9833333333333334 | 0 |
| 0.9840277777777778 | 0 |
| 0.9847222222222222 | 0 |
| 0.9854166666666666 | 0 |
| 0.9861111111111112 | 0 |
| 0.9868055555555556 | 0 |
| 0.9874999999999999 | 0 |
| 0.9881944444444444 | 0 |
| 0.9888888888888889 | 0 |
| 0.9895833333333334 | 0 |
| 0.9902777777777777 | 0 |
| 0.9909722222222223 | 0 |
| 0.9916666666666667 | 0 |
| 0.9923611111111111 | 0 |
| 0.9930555555555555 | 0 |
| 0.99375 | 0 |
| 0.9944444444444445 | 0 |
| 0.9951388888888889 | 0 |
| 0.9958333333333332 | 0 |
| 0.9965277777777778 | 0 |
| 0.9972222222222222 | 0 |
| 0.9979166666666667 | 0 |
| 0.998611111111111 | 0 |
| 0.9993055555555556 | 0 |